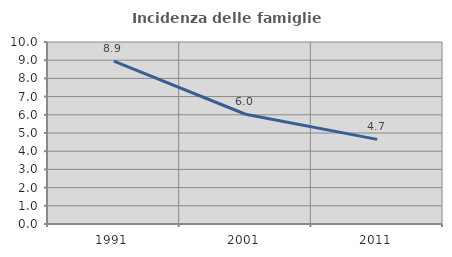
| Category | Incidenza delle famiglie numerose |
|---|---|
| 1991.0 | 8.945 |
| 2001.0 | 6.03 |
| 2011.0 | 4.651 |